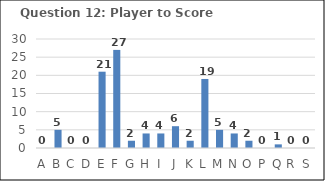
| Category | Series 0 |
|---|---|
| A | 0 |
| B | 5 |
| C | 0 |
| D | 0 |
| E | 21 |
| F | 27 |
| G | 2 |
| H | 4 |
| I | 4 |
| J | 6 |
| K | 2 |
| L | 19 |
| M | 5 |
| N | 4 |
| O | 2 |
| P | 0 |
| Q | 1 |
| R | 0 |
| S | 0 |